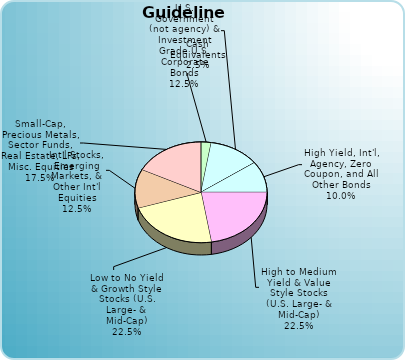
| Category | Series 0 |
|---|---|
| Cash Equivalents | 0.025 |
| U.S. Government (not agency) & Investment Grade U.S. Corporate Bonds | 0.125 |
| Municipal (federally tax-free) Bonds | 0 |
| High Yield, Int'l, Agency, Zero Coupon, and All Other Bonds | 0.1 |
| High to Medium Yield & Value Style Stocks (U.S. Large- & Mid-Cap) | 0.225 |
| Low to No Yield & Growth Style Stocks (U.S. Large- & Mid-Cap) | 0.225 |
| Int'l Stocks, Emerging Markets, & Other Int'l Equities | 0.125 |
| Small-Cap, Precious Metals, Sector Funds, Real Estate, LPs, Misc. Equities | 0.175 |